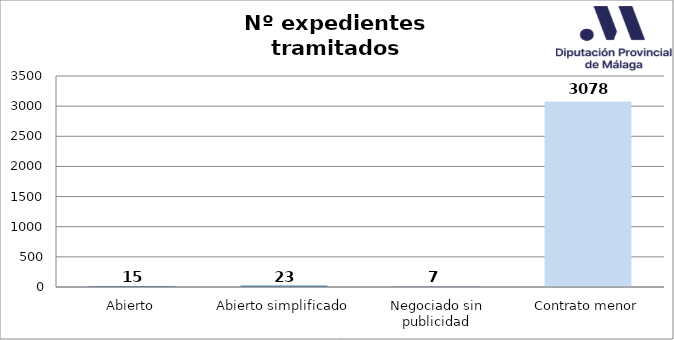
| Category | Nº expedientes |
|---|---|
| Abierto | 15 |
| Abierto simplificado | 23 |
| Negociado sin publicidad | 7 |
| Contrato menor | 3078 |